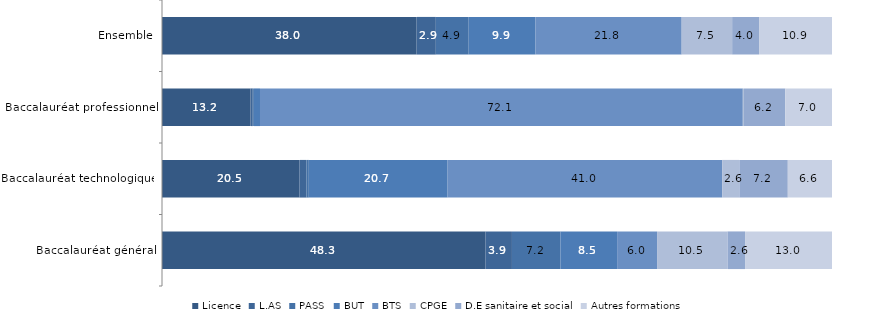
| Category | Licence | L.AS | PASS | BUT | BTS | CPGE | D.E sanitaire et social | Autres formations |
|---|---|---|---|---|---|---|---|---|
| Baccalauréat général | 48.292 | 3.938 | 7.239 | 8.457 | 5.966 | 10.522 | 2.612 | 12.974 |
| Baccalauréat technologique | 20.53 | 1.021 | 0.362 | 20.717 | 40.982 | 2.566 | 7.225 | 6.597 |
| Baccalauréat professionnel | 13.224 | 0.323 | 0.164 | 0.914 | 72.066 | 0.17 | 6.161 | 6.979 |
| Ensemble | 38.004 | 2.866 | 4.904 | 9.943 | 21.845 | 7.534 | 4.019 | 10.884 |